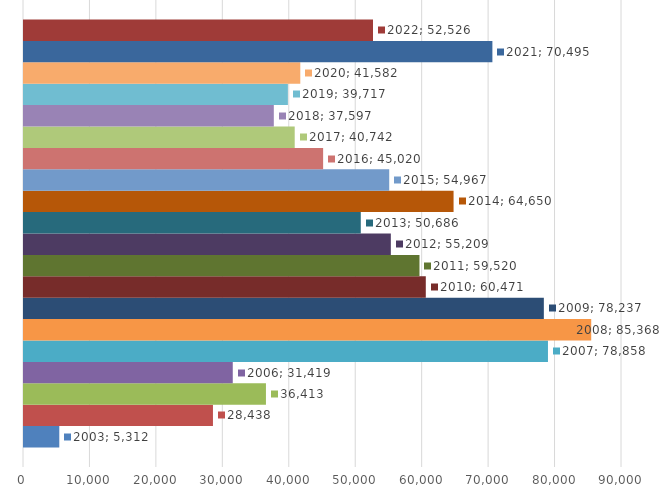
| Category | 2003 | 2004 | 2005 | 2006 | 2007 | 2008 | 2009 | 2010 | 2011 | 2012 | 2013 | 2014 | 2015 | 2016 | 2017 | 2018 | 2019 | 2020 | 2021 | 2022 |
|---|---|---|---|---|---|---|---|---|---|---|---|---|---|---|---|---|---|---|---|---|
| 0 | 5312 | 28438 | 36413 | 31419 | 78858 | 85368 | 78237 | 60471 | 59520 | 55209 | 50686 | 64650 | 54967 | 45020 | 40742 | 37597 | 39717 | 41582 | 70495 | 52526 |